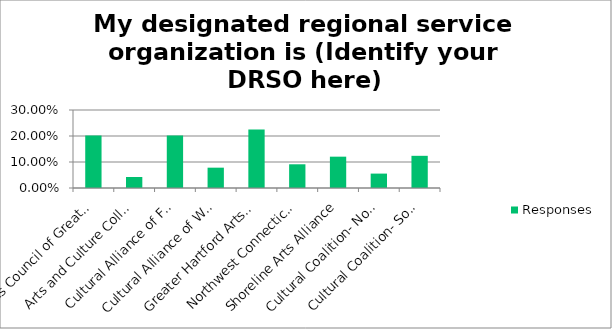
| Category | Responses |
|---|---|
| Arts Council of Greater New Haven | 0.202 |
| Arts and Culture Collaborative, Waterbury Region | 0.042 |
| Cultural Alliance of Fairfield County | 0.202 |
| Cultural Alliance of Western Connecticut | 0.078 |
| Greater Hartford Arts Council | 0.225 |
| Northwest Connecticut Arts Council | 0.091 |
| Shoreline Arts Alliance | 0.12 |
| Cultural Coalition- Northeast Region | 0.055 |
| Cultural Coalition- Southeast Region | 0.124 |